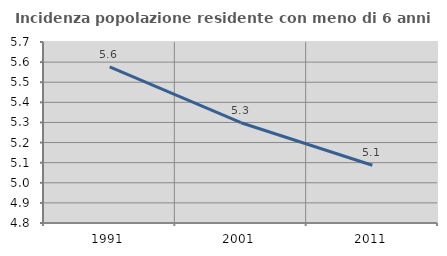
| Category | Incidenza popolazione residente con meno di 6 anni |
|---|---|
| 1991.0 | 5.576 |
| 2001.0 | 5.299 |
| 2011.0 | 5.087 |